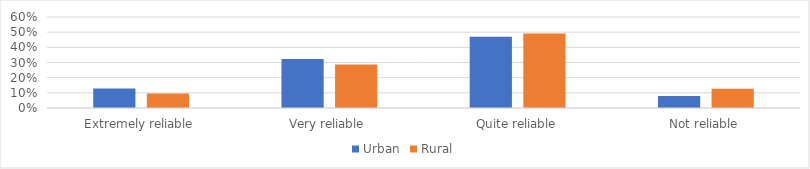
| Category | Urban | Rural |
|---|---|---|
| Extremely reliable | 0.128 | 0.095 |
| Very reliable | 0.323 | 0.286 |
| Quite reliable | 0.47 | 0.492 |
| Not reliable | 0.079 | 0.127 |